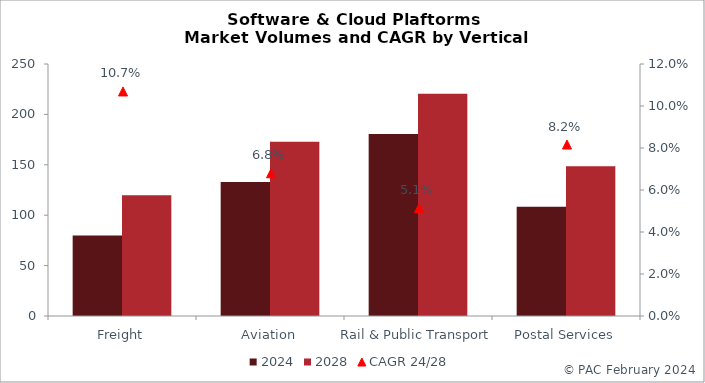
| Category | 2024 | 2028 |
|---|---|---|
| Freight | 79.786 | 119.786 |
| Aviation | 132.978 | 172.978 |
| Rail & Public Transport | 180.544 | 220.544 |
| Postal Services | 108.44 | 148.44 |